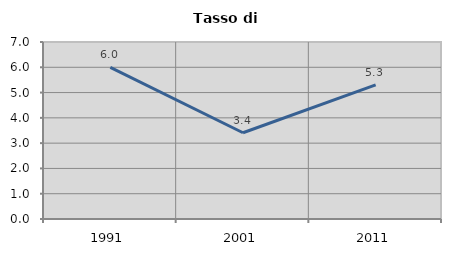
| Category | Tasso di disoccupazione   |
|---|---|
| 1991.0 | 5.996 |
| 2001.0 | 3.411 |
| 2011.0 | 5.304 |